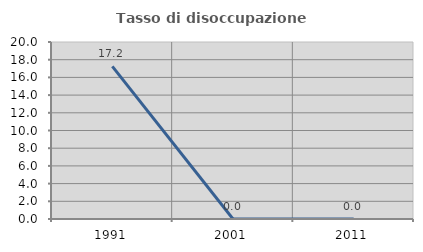
| Category | Tasso di disoccupazione giovanile  |
|---|---|
| 1991.0 | 17.241 |
| 2001.0 | 0 |
| 2011.0 | 0 |